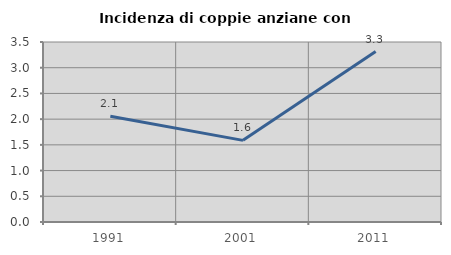
| Category | Incidenza di coppie anziane con figli |
|---|---|
| 1991.0 | 2.057 |
| 2001.0 | 1.587 |
| 2011.0 | 3.315 |